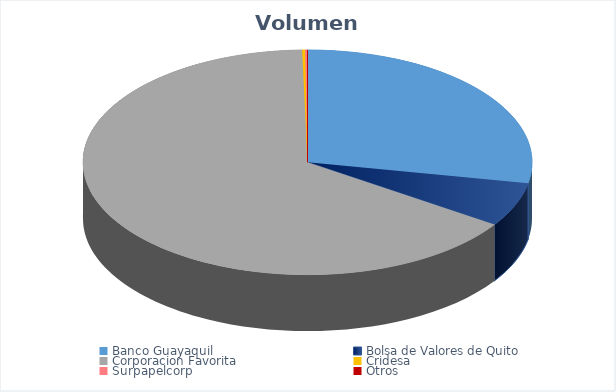
| Category | VOLUMEN ($USD) |
|---|---|
| Banco Guayaquil | 70500 |
| Bolsa de Valores de Quito | 16050 |
| Corporacion Favorita | 164446.45 |
| Cridesa | 522.75 |
| Surpapelcorp | 382.5 |
| Otros | 52.8 |